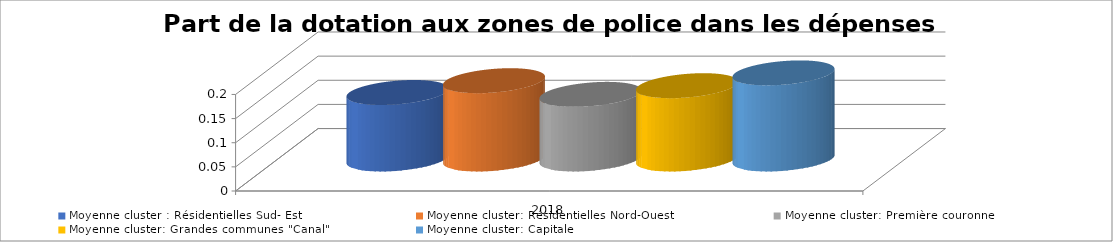
| Category | Moyenne cluster : Résidentielles Sud- Est | Moyenne cluster: Résidentielles Nord-Ouest | Moyenne cluster: Première couronne | Moyenne cluster: Grandes communes "Canal" | Moyenne cluster: Capitale |
|---|---|---|---|---|---|
| 2018 | 0.138 | 0.162 | 0.134 | 0.152 | 0.178 |